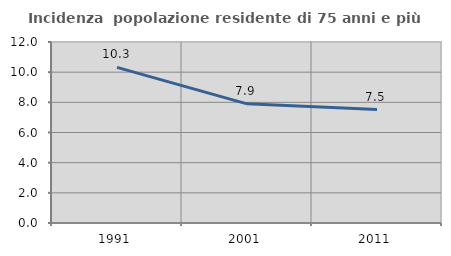
| Category | Incidenza  popolazione residente di 75 anni e più |
|---|---|
| 1991.0 | 10.319 |
| 2001.0 | 7.898 |
| 2011.0 | 7.525 |